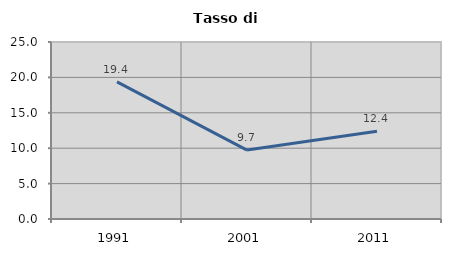
| Category | Tasso di disoccupazione   |
|---|---|
| 1991.0 | 19.368 |
| 2001.0 | 9.738 |
| 2011.0 | 12.387 |